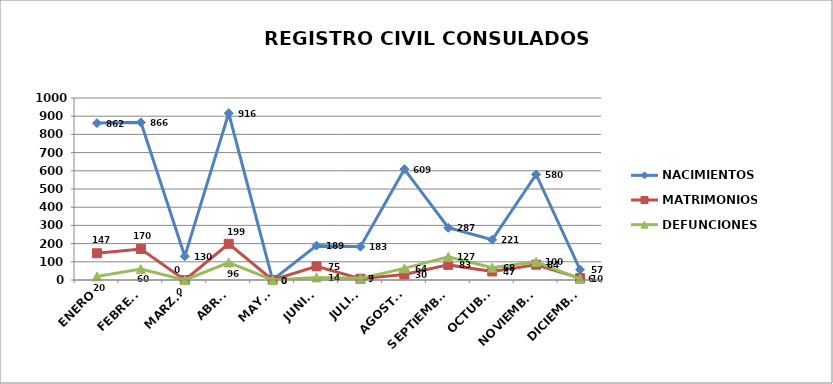
| Category | NACIMIENTOS | MATRIMONIOS | DEFUNCIONES |
|---|---|---|---|
| ENERO | 862 | 147 | 20 |
| FEBRERO | 866 | 170 | 60 |
| MARZO | 130 | 0 | 0 |
| ABRIL | 916 | 199 | 96 |
| MAYO | 0 | 0 | 0 |
| JUNIO | 189 | 75 | 14 |
| JULIO | 183 | 7 | 9 |
| AGOSTO | 609 | 30 | 64 |
| SEPTIEMBRE | 287 | 83 | 127 |
| OCTUBRE | 221 | 47 | 68 |
| NOVIEMBRE | 580 | 84 | 100 |
| DICIEMBRE | 57 | 10 | 6 |